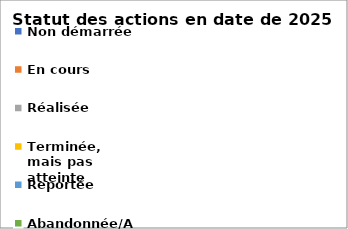
| Category | 2025 |
|---|---|
| Non démarrée | 0 |
| En cours | 0 |
| Réalisée | 0 |
| Terminée, mais pas atteinte | 0 |
| Reportée | 0 |
| Abandonnée/Annulée | 0 |